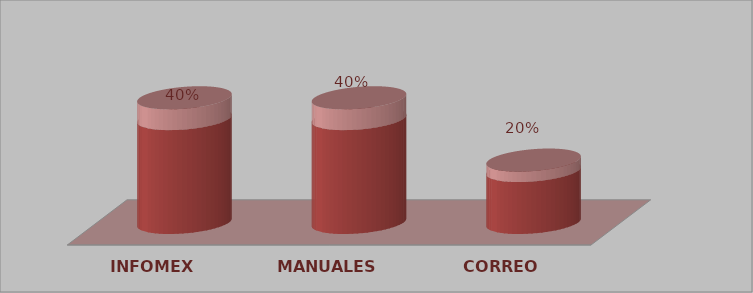
| Category | Series 0 | Series 1 |
|---|---|---|
| INFOMEX | 2 | 0.4 |
| MANUALES | 2 | 0.4 |
| CORREO | 1 | 0.2 |